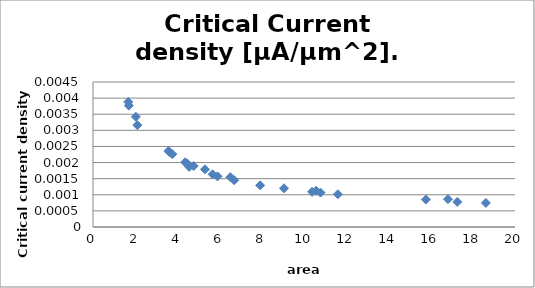
| Category | Critical Current density [A/um^2] |
|---|---|
| 1.6967999999999999 | 0.004 |
| 2.0296 | 0.003 |
| 1.6683999999999999 | 0.004 |
| 2.1037 | 0.003 |
| 4.772200000000001 | 0.002 |
| 3.7600000000000002 | 0.002 |
| 3.632 | 0.002 |
| 3.5752 | 0.002 |
| 6.5095 | 0.002 |
| 4.558 | 0.002 |
| 4.472 | 0.002 |
| 4.368 | 0.002 |
| 6.6926000000000005 | 0.001 |
| 7.9222 | 0.001 |
| 5.902 | 0.002 |
| 5.668000000000001 | 0.002 |
| 5.3072 | 0.002 |
| 10.7835 | 0.001 |
| 11.6046 | 0.001 |
| 10.3834 | 0.001 |
| 9.052 | 0.001 |
| 10.573500000000001 | 0.001 |
| 15.7752 | 0.001 |
| 18.618599999999997 | 0.001 |
| 17.264 | 0.001 |
| 16.822 | 0.001 |